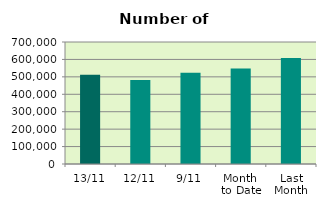
| Category | Series 0 |
|---|---|
| 13/11 | 512594 |
| 12/11 | 481350 |
| 9/11 | 522856 |
| Month 
to Date | 547423.778 |
| Last
Month | 607838.609 |